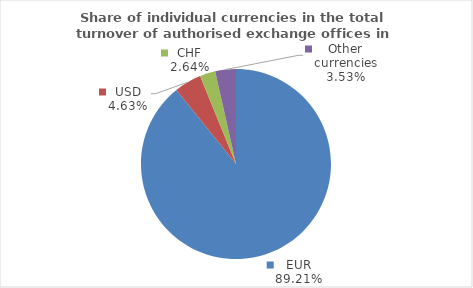
| Category | Series 0 |
|---|---|
| EUR | 89.206 |
| USD | 4.626 |
| CHF | 2.64 |
| Other currencies | 3.528 |